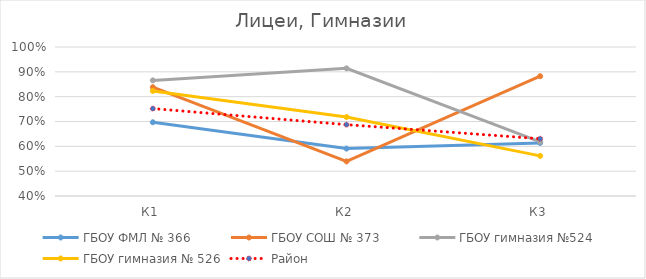
| Category | ГБОУ ФМЛ № 366 | ГБОУ СОШ № 373 | ГБОУ гимназия №524 | ГБОУ гимназия № 526 | Район |
|---|---|---|---|---|---|
| К1 | 0.697 | 0.838 | 0.866 | 0.823 | 0.752 |
| К2 | 0.591 | 0.539 | 0.914 | 0.718 | 0.687 |
| К3 | 0.614 | 0.882 | 0.618 | 0.562 | 0.631 |